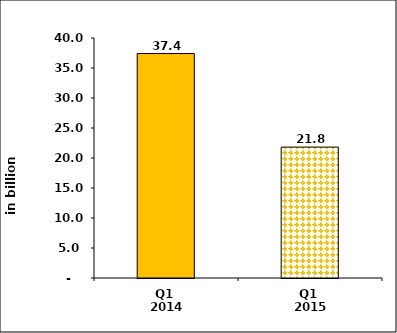
| Category | Series 0 |
|---|---|
| Q1 
2014 | 37.413 |
| Q1 
2015 | 21.816 |